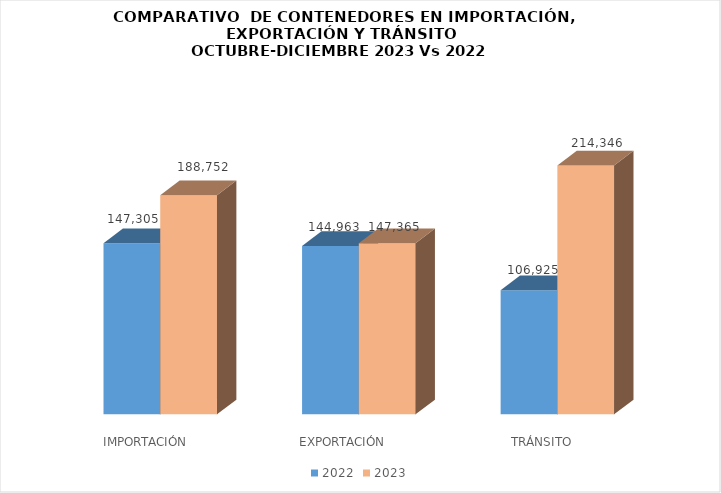
| Category | 2022 | 2023 |
|---|---|---|
|  IMPORTACIÓN | 147305 | 188751.75 |
| EXPORTACIÓN | 144963 | 147365 |
| TRÁNSITO | 106925 | 214346.25 |